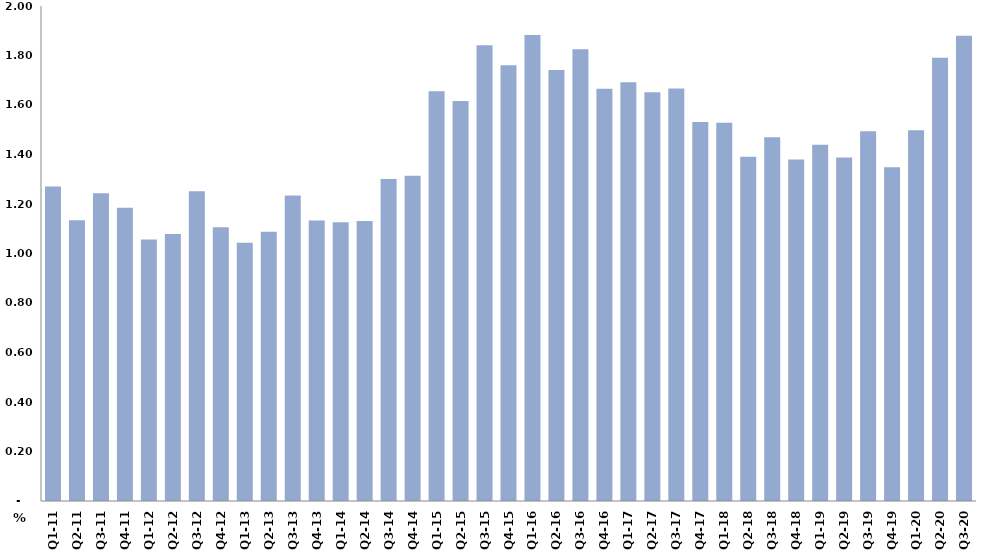
| Category | النسبة المئوية من الناتج المحلي الاجمالي
Percent of Total GDP |
|---|---|
| Q1-11 | 1.27 |
| Q2-11 | 1.135 |
| Q3-11 | 1.243 |
| Q4-11 | 1.184 |
| Q1-12 | 1.056 |
| Q2-12 | 1.079 |
| Q3-12 | 1.251 |
| Q4-12 | 1.106 |
| Q1-13 | 1.043 |
| Q2-13 | 1.088 |
| Q3-13 | 1.235 |
| Q4-13 | 1.134 |
| Q1-14 | 1.126 |
| Q2-14 | 1.131 |
| Q3-14 | 1.301 |
| Q4-14 | 1.314 |
| Q1-15 | 1.655 |
| Q2-15 | 1.617 |
| Q3-15 | 1.842 |
| Q4-15 | 1.761 |
| Q1-16 | 1.882 |
| Q2-16 | 1.741 |
| Q3-16 | 1.825 |
| Q4-16 | 1.666 |
| Q1-17 | 1.692 |
| Q2-17 | 1.652 |
| Q3-17 | 1.666 |
| Q4-17 | 1.531 |
| Q1-18 | 1.529 |
| Q2-18 | 1.39 |
| Q3-18 | 1.47 |
| Q4-18 | 1.38 |
| Q1-19 | 1.44 |
| Q2-19 | 1.388 |
| Q3-19 | 1.494 |
| Q4-19 | 1.349 |
| Q1-20 | 1.498 |
| Q2-20 | 1.791 |
| Q3-20 | 1.88 |